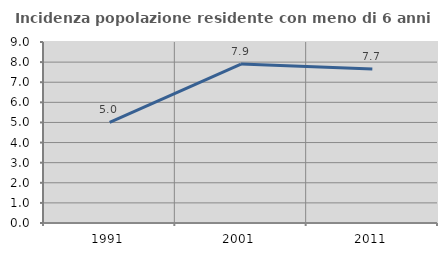
| Category | Incidenza popolazione residente con meno di 6 anni |
|---|---|
| 1991.0 | 4.998 |
| 2001.0 | 7.905 |
| 2011.0 | 7.655 |